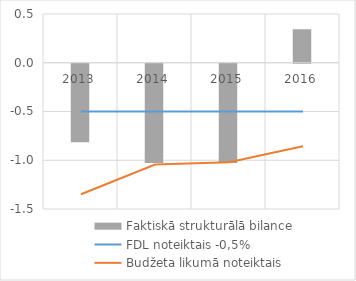
| Category | Faktiskā strukturālā bilance |
|---|---|
| 2013.0 | -0.805 |
| 2014.0 | -1.019 |
| 2015.0 | -1.017 |
| 2016.0 | 0.343 |